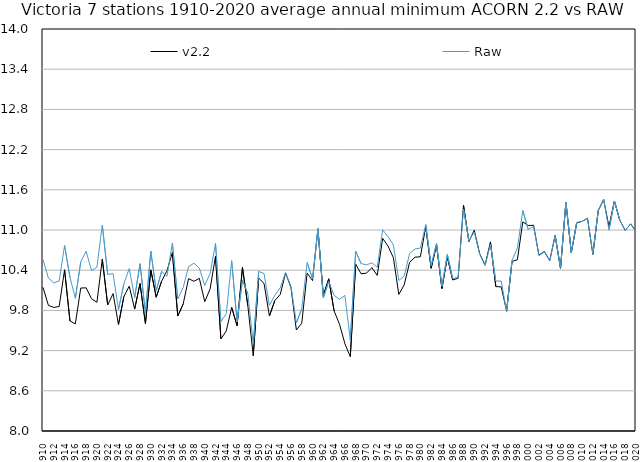
| Category | v2.2 | Raw |
|---|---|---|
| 1910 | 10.144 | 10.558 |
| 1911 | 9.875 | 10.282 |
| 1912 | 9.844 | 10.21 |
| 1913 | 9.859 | 10.239 |
| 1914 | 10.406 | 10.768 |
| 1915 | 9.643 | 10.294 |
| 1916 | 9.599 | 9.979 |
| 1917 | 10.134 | 10.522 |
| 1918 | 10.137 | 10.684 |
| 1919 | 9.974 | 10.395 |
| 1920 | 9.921 | 10.443 |
| 1921 | 10.565 | 11.074 |
| 1922 | 9.881 | 10.336 |
| 1923 | 10.051 | 10.349 |
| 1924 | 9.589 | 9.812 |
| 1925 | 10.007 | 10.198 |
| 1926 | 10.162 | 10.425 |
| 1927 | 9.82 | 9.99 |
| 1928 | 10.2 | 10.497 |
| 1929 | 9.604 | 9.761 |
| 1930 | 10.404 | 10.685 |
| 1931 | 9.997 | 10.089 |
| 1932 | 10.235 | 10.383 |
| 1933 | 10.392 | 10.31 |
| 1934 | 10.664 | 10.807 |
| 1935 | 9.716 | 9.97 |
| 1936 | 9.895 | 10.14 |
| 1937 | 10.274 | 10.452 |
| 1938 | 10.234 | 10.504 |
| 1939 | 10.279 | 10.431 |
| 1940 | 9.93 | 10.172 |
| 1941 | 10.12 | 10.351 |
| 1942 | 10.61 | 10.8 |
| 1943 | 9.374 | 9.632 |
| 1944 | 9.494 | 9.751 |
| 1945 | 9.844 | 10.542 |
| 1946 | 9.571 | 9.626 |
| 1947 | 10.44 | 10.25 |
| 1948 | 9.869 | 10.051 |
| 1949 | 9.124 | 9.299 |
| 1950 | 10.283 | 10.381 |
| 1951 | 10.203 | 10.351 |
| 1952 | 9.716 | 9.874 |
| 1953 | 9.947 | 10.026 |
| 1954 | 10.037 | 10.135 |
| 1955 | 10.359 | 10.365 |
| 1956 | 10.141 | 10.159 |
| 1957 | 9.508 | 9.613 |
| 1958 | 9.608 | 9.824 |
| 1959 | 10.356 | 10.514 |
| 1960 | 10.244 | 10.271 |
| 1961 | 11.012 | 11.025 |
| 1962 | 10.021 | 9.985 |
| 1963 | 10.272 | 10.233 |
| 1964 | 9.792 | 10.025 |
| 1965 | 9.594 | 9.965 |
| 1966 | 9.303 | 10.024 |
| 1967 | 9.11 | 9.359 |
| 1968 | 10.49 | 10.683 |
| 1969 | 10.347 | 10.499 |
| 1970 | 10.355 | 10.48 |
| 1971 | 10.438 | 10.509 |
| 1972 | 10.323 | 10.444 |
| 1973 | 10.875 | 11.002 |
| 1974 | 10.761 | 10.9 |
| 1975 | 10.585 | 10.776 |
| 1976 | 10.038 | 10.247 |
| 1977 | 10.181 | 10.312 |
| 1978 | 10.516 | 10.649 |
| 1979 | 10.594 | 10.717 |
| 1980 | 10.6 | 10.731 |
| 1981 | 11.051 | 11.081 |
| 1982 | 10.429 | 10.469 |
| 1983 | 10.778 | 10.801 |
| 1984 | 10.126 | 10.161 |
| 1985 | 10.599 | 10.636 |
| 1986 | 10.254 | 10.278 |
| 1987 | 10.28 | 10.291 |
| 1988 | 11.371 | 11.312 |
| 1989 | 10.829 | 10.842 |
| 1990 | 10.997 | 10.969 |
| 1991 | 10.648 | 10.639 |
| 1992 | 10.476 | 10.469 |
| 1993 | 10.823 | 10.786 |
| 1994 | 10.155 | 10.238 |
| 1995 | 10.151 | 10.239 |
| 1996 | 9.793 | 9.776 |
| 1997 | 10.53 | 10.547 |
| 1998 | 10.557 | 10.73 |
| 1999 | 11.121 | 11.291 |
| 2000 | 11.067 | 11.009 |
| 2001 | 11.071 | 11.053 |
| 2002 | 10.624 | 10.617 |
| 2003 | 10.679 | 10.671 |
| 2004 | 10.543 | 10.544 |
| 2005 | 10.919 | 10.917 |
| 2006 | 10.428 | 10.431 |
| 2007 | 11.415 | 11.417 |
| 2008 | 10.662 | 10.666 |
| 2009 | 11.105 | 11.113 |
| 2010 | 11.129 | 11.129 |
| 2011 | 11.175 | 11.177 |
| 2012 | 10.637 | 10.647 |
| 2013 | 11.289 | 11.295 |
| 2014 | 11.455 | 11.454 |
| 2015 | 11.046 | 10.998 |
| 2016 | 11.432 | 11.432 |
| 2017 | 11.144 | 11.144 |
| 2018 | 10.995 | 10.998 |
| 2019 | 11.092 | 11.086 |
| 2020 | 10.976 | 10.976 |